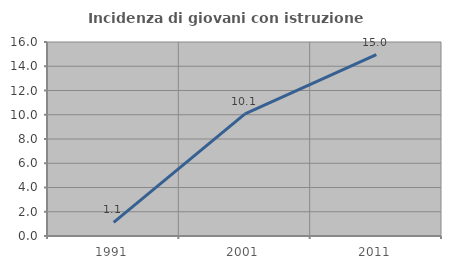
| Category | Incidenza di giovani con istruzione universitaria |
|---|---|
| 1991.0 | 1.124 |
| 2001.0 | 10.078 |
| 2011.0 | 14.961 |